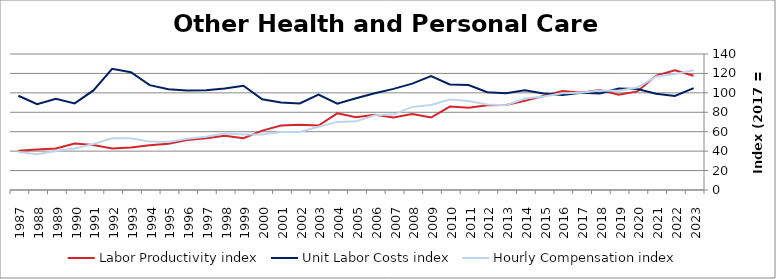
| Category | Labor Productivity index | Unit Labor Costs index | Hourly Compensation index |
|---|---|---|---|
| 2023.0 | 117.55 | 104.847 | 123.248 |
| 2022.0 | 123.237 | 96.801 | 119.295 |
| 2021.0 | 117.77 | 99.14 | 116.757 |
| 2020.0 | 101.465 | 103.896 | 105.417 |
| 2019.0 | 97.972 | 104.402 | 102.285 |
| 2018.0 | 102.99 | 99.469 | 102.443 |
| 2017.0 | 100 | 100 | 100 |
| 2016.0 | 101.867 | 97.677 | 99.501 |
| 2015.0 | 96.74 | 99.389 | 96.149 |
| 2014.0 | 91.771 | 102.582 | 94.141 |
| 2013.0 | 87.485 | 99.591 | 87.128 |
| 2012.0 | 87.284 | 100.739 | 87.929 |
| 2011.0 | 84.763 | 108.101 | 91.63 |
| 2010.0 | 85.842 | 108.611 | 93.234 |
| 2009.0 | 74.622 | 117.328 | 87.553 |
| 2008.0 | 78.127 | 109.525 | 85.569 |
| 2007.0 | 74.575 | 104.092 | 77.626 |
| 2006.0 | 77.366 | 99.515 | 76.991 |
| 2005.0 | 74.897 | 94.379 | 70.688 |
| 2004.0 | 78.91 | 88.837 | 70.101 |
| 2003.0 | 66.297 | 98.302 | 65.171 |
| 2002.0 | 67.13 | 89.056 | 59.784 |
| 2001.0 | 66.419 | 89.985 | 59.767 |
| 2000.0 | 61.13 | 93.329 | 57.052 |
| 1999.0 | 53.292 | 107.277 | 57.171 |
| 1998.0 | 55.728 | 104.375 | 58.166 |
| 1997.0 | 53.371 | 102.612 | 54.765 |
| 1996.0 | 51.502 | 102.445 | 52.761 |
| 1995.0 | 47.642 | 103.721 | 49.414 |
| 1994.0 | 46.151 | 107.919 | 49.806 |
| 1993.0 | 43.854 | 121.193 | 53.148 |
| 1992.0 | 42.638 | 124.809 | 53.216 |
| 1991.0 | 46.234 | 102.527 | 47.402 |
| 1990.0 | 47.907 | 89.199 | 42.733 |
| 1989.0 | 42.753 | 93.833 | 40.117 |
| 1988.0 | 41.666 | 88.282 | 36.784 |
| 1987.0 | 40.397 | 97.021 | 39.194 |